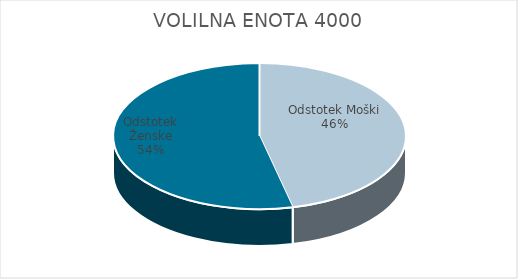
| Category | VOLILNA ENOTA 4000 | #REF! | Slovenija skupaj |
|---|---|---|---|
| Odstotek Moški | 25.73 |  | 25.28 |
| Odstotek Ženske | 29.76 |  | 27.73 |